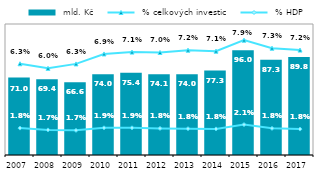
| Category |  mld. Kč |
|---|---|
| 2007 | 70.985 |
| 2008 | 69.388 |
| 2009 | 66.554 |
| 2010 | 74.018 |
| 2011 | 75.426 |
| 2012 | 74.08 |
| 2013 | 73.986 |
| 2014 | 77.338 |
| 2015 | 95.977 |
| 2016 | 87.256 |
| 2017 | 89.82 |